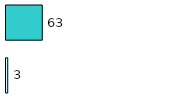
| Category | Series 0 | Series 1 |
|---|---|---|
| 0 | 3 | 63 |